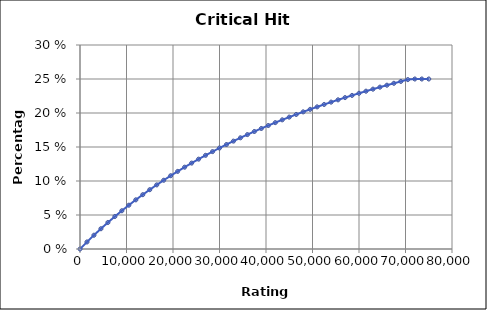
| Category | Critical Hit Chance |
|---|---|
| 0.0 | 0 |
| 1500.0 | 0.01 |
| 3000.0 | 0.02 |
| 4500.0 | 0.03 |
| 6000.0 | 0.039 |
| 7500.0 | 0.048 |
| 9000.0 | 0.056 |
| 10500.0 | 0.064 |
| 12000.0 | 0.072 |
| 13500.0 | 0.08 |
| 15000.0 | 0.087 |
| 16500.0 | 0.094 |
| 18000.0 | 0.101 |
| 19500.0 | 0.108 |
| 21000.0 | 0.114 |
| 22500.0 | 0.12 |
| 24000.0 | 0.126 |
| 25500.0 | 0.132 |
| 27000.0 | 0.138 |
| 28500.0 | 0.143 |
| 30000.0 | 0.149 |
| 31500.0 | 0.154 |
| 33000.0 | 0.159 |
| 34500.0 | 0.164 |
| 36000.0 | 0.168 |
| 37500.0 | 0.173 |
| 39000.0 | 0.177 |
| 40500.0 | 0.182 |
| 42000.0 | 0.186 |
| 43500.0 | 0.19 |
| 45000.0 | 0.194 |
| 46500.0 | 0.198 |
| 48000.0 | 0.202 |
| 49500.0 | 0.205 |
| 51000.0 | 0.209 |
| 52500.0 | 0.213 |
| 54000.0 | 0.216 |
| 55500.0 | 0.219 |
| 57000.0 | 0.223 |
| 58500.0 | 0.226 |
| 60000.0 | 0.229 |
| 61500.0 | 0.232 |
| 63000.0 | 0.235 |
| 64500.0 | 0.238 |
| 66000.0 | 0.241 |
| 67500.0 | 0.244 |
| 69000.0 | 0.246 |
| 70500.0 | 0.249 |
| 72000.0 | 0.25 |
| 73500.0 | 0.25 |
| 75000.0 | 0.25 |